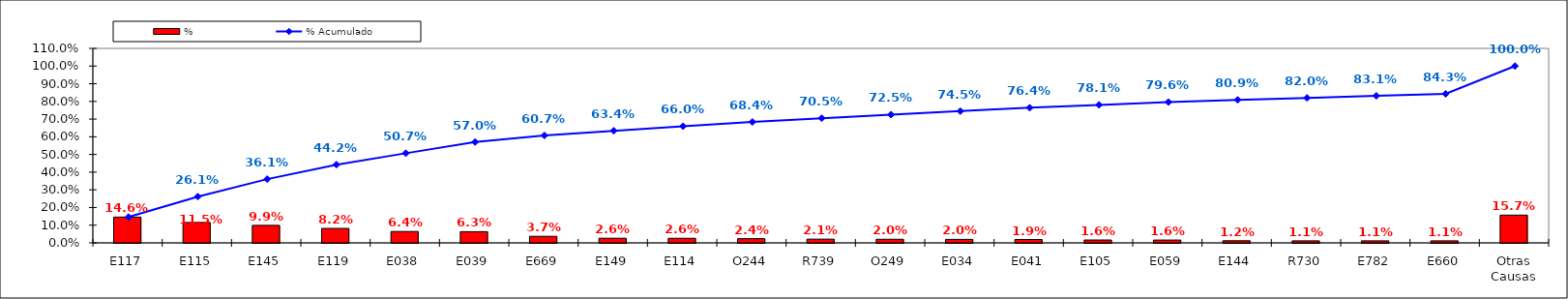
| Category | % |
|---|---|
| E117 | 0.146 |
| E115 | 0.115 |
| E145 | 0.099 |
| E119 | 0.082 |
| E038 | 0.064 |
| E039 | 0.063 |
| E669 | 0.037 |
| E149 | 0.026 |
| E114 | 0.026 |
| O244 | 0.024 |
| R739 | 0.021 |
| O249 | 0.02 |
| E034 | 0.02 |
| E041 | 0.019 |
| E105 | 0.016 |
| E059 | 0.016 |
| E144 | 0.012 |
| R730 | 0.011 |
| E782 | 0.011 |
| E660 | 0.011 |
| Otras Causas | 0.157 |